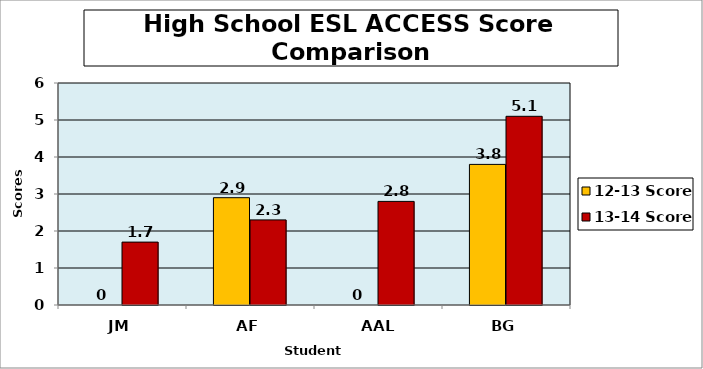
| Category | 12-13 Score | 13-14 Score |
|---|---|---|
| JM | 0 | 1.7 |
| AF | 2.9 | 2.3 |
| AAL | 0 | 2.8 |
| BG | 3.8 | 5.1 |